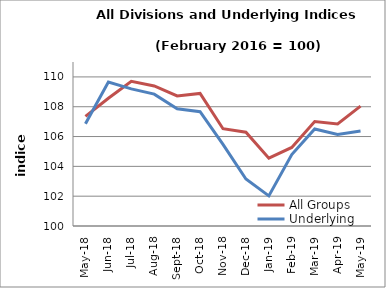
| Category | All Groups | Underlying |
|---|---|---|
| 2018-05-01 | 107.355 | 106.863 |
| 2018-06-01 | 108.567 | 109.659 |
| 2018-07-01 | 109.702 | 109.198 |
| 2018-08-01 | 109.392 | 108.845 |
| 2018-09-01 | 108.722 | 107.857 |
| 2018-10-01 | 108.895 | 107.664 |
| 2018-11-01 | 106.524 | 105.471 |
| 2018-12-01 | 106.292 | 103.148 |
| 2019-01-01 | 104.55 | 102.019 |
| 2019-02-01 | 105.272 | 104.794 |
| 2019-03-01 | 107.012 | 106.51 |
| 2019-04-01 | 106.842 | 106.143 |
| 2019-05-01 | 108.044 | 106.37 |